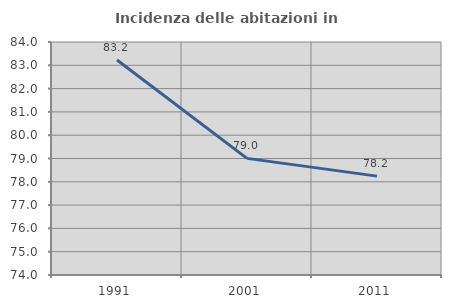
| Category | Incidenza delle abitazioni in proprietà  |
|---|---|
| 1991.0 | 83.23 |
| 2001.0 | 79.006 |
| 2011.0 | 78.244 |